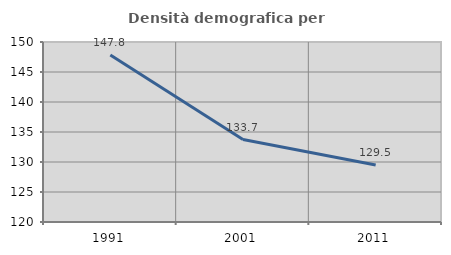
| Category | Densità demografica |
|---|---|
| 1991.0 | 147.832 |
| 2001.0 | 133.749 |
| 2011.0 | 129.488 |